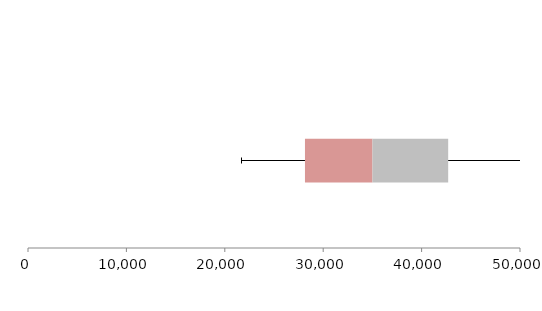
| Category | Series 1 | Series 2 | Series 3 |
|---|---|---|---|
| 0 | 28147.204 | 6859.747 | 7694.209 |